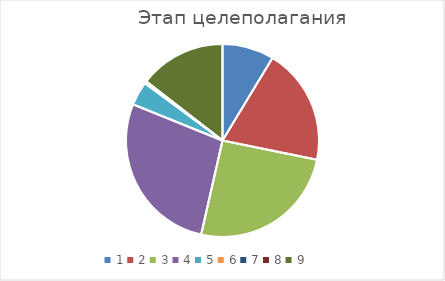
| Category | Series 0 |
|---|---|
| 0 | 0.09 |
| 1 | 0.204 |
| 2 | 0.265 |
| 3 | 0.287 |
| 4 | 0.042 |
| 5 | 0.001 |
| 6 | 0.001 |
| 7 | 0.001 |
| 8 | 0.151 |